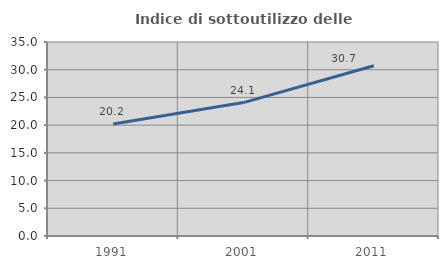
| Category | Indice di sottoutilizzo delle abitazioni  |
|---|---|
| 1991.0 | 20.222 |
| 2001.0 | 24.072 |
| 2011.0 | 30.72 |